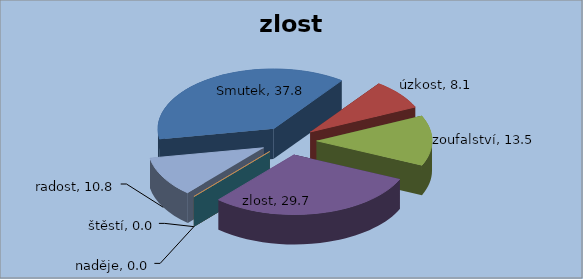
| Category | zlost |
|---|---|
| Smutek | 37.838 |
| úzkost | 8.108 |
| zoufalství | 13.514 |
| zlost | 29.73 |
| naděje | 0 |
| štěstí | 0 |
| radost | 10.811 |